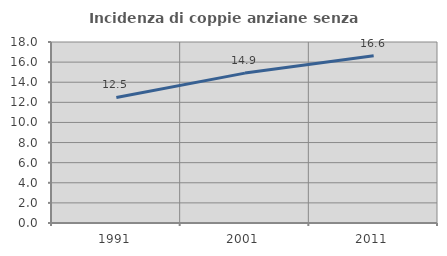
| Category | Incidenza di coppie anziane senza figli  |
|---|---|
| 1991.0 | 12.49 |
| 2001.0 | 14.907 |
| 2011.0 | 16.634 |